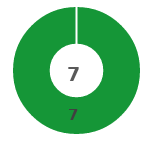
| Category | Series 0 |
|---|---|
| 0 | 7 |
| 1 | 0 |
| 2 | 0 |
| 3 | 0 |
| 4 | 0 |